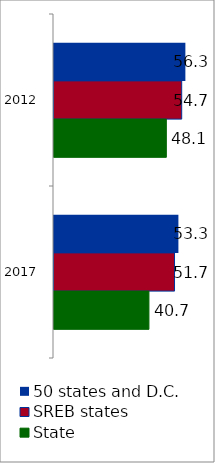
| Category | 50 states and D.C. | SREB states | State |
|---|---|---|---|
| 2012.0 | 56.304 | 54.724 | 48.142 |
| 2017.0 | 53.317 | 51.654 | 40.681 |